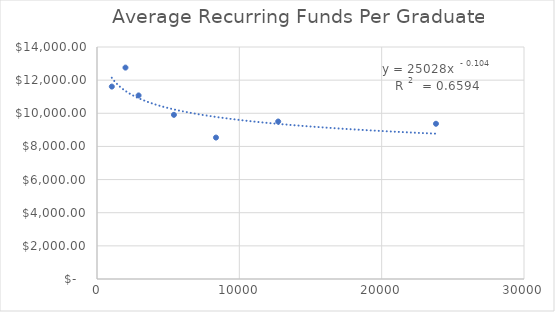
| Category | Average Recurring Funds Per Graduate |
|---|---|
| 1041.0 | 11611.492 |
| 2000.3333333333333 | 12756.989 |
| 2923.0 | 11077.172 |
| 5404.4 | 9906.889 |
| 8359.5 | 8535.363 |
| 12730.25 | 9503.219 |
| 23816.0 | 9368.122 |